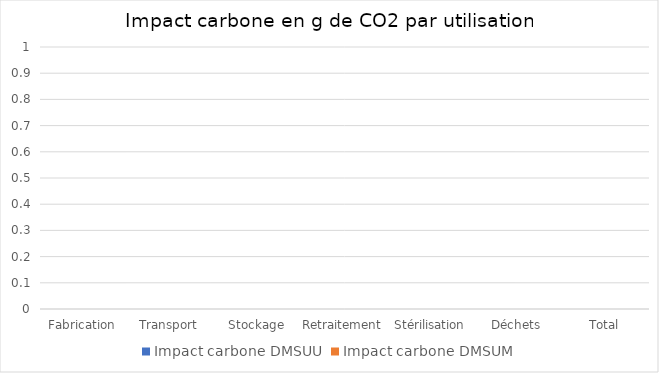
| Category | Impact carbone |
|---|---|
| Fabrication | 0 |
| Transport | 0 |
| Stockage | 0 |
| Retraitement | 0 |
| Stérilisation | 0 |
| Déchets | 0 |
| Total | 0 |